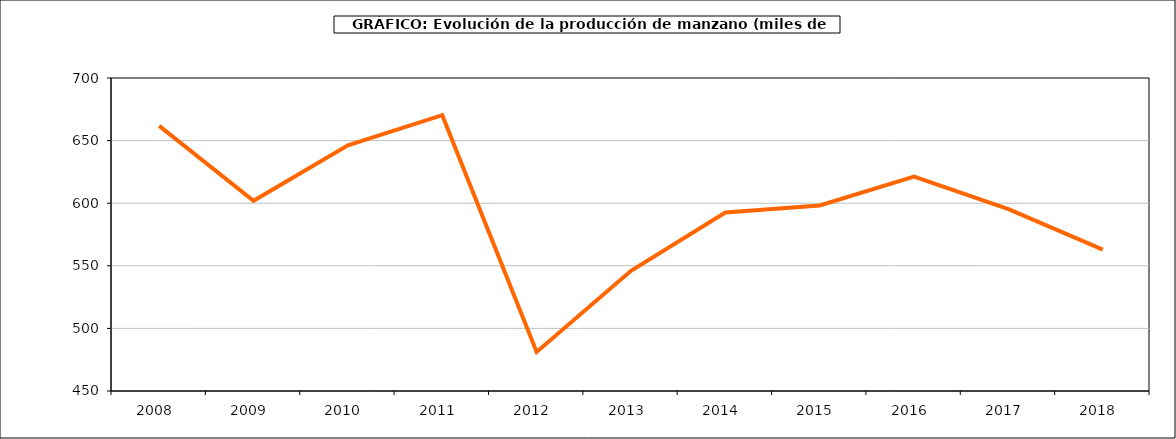
| Category | producción manzano |
|---|---|
| 2008.0 | 661.724 |
| 2009.0 | 601.979 |
| 2010.0 | 646.264 |
| 2011.0 | 670.284 |
| 2012.0 | 481.223 |
| 2013.0 | 545.992 |
| 2014.0 | 592.576 |
| 2015.0 | 598.207 |
| 2016.0 | 621.164 |
| 2017.0 | 595.202 |
| 2018.0 | 562.961 |